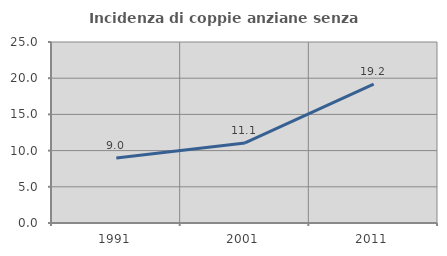
| Category | Incidenza di coppie anziane senza figli  |
|---|---|
| 1991.0 | 8.978 |
| 2001.0 | 11.053 |
| 2011.0 | 19.173 |